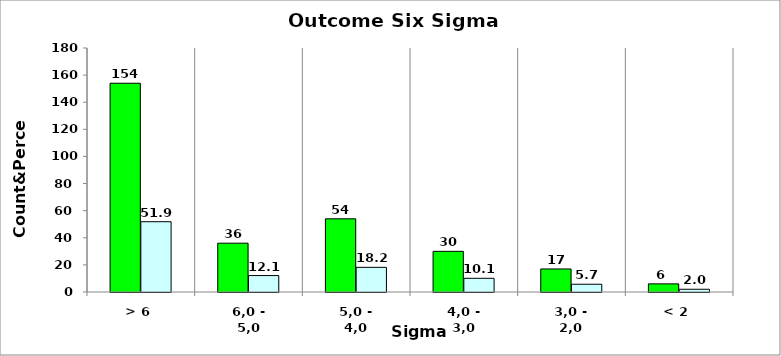
| Category | Series 0 | 51,9 12,1 18,2 10,1 5,7 2,0 |
|---|---|---|
| > 6 | 154 | 51.852 |
| 6,0 - 5,0 | 36 | 12.121 |
| 5,0 - 4,0 | 54 | 18.182 |
| 4,0 - 3,0 | 30 | 10.101 |
| 3,0 - 2,0 | 17 | 5.724 |
| < 2 | 6 | 2.02 |